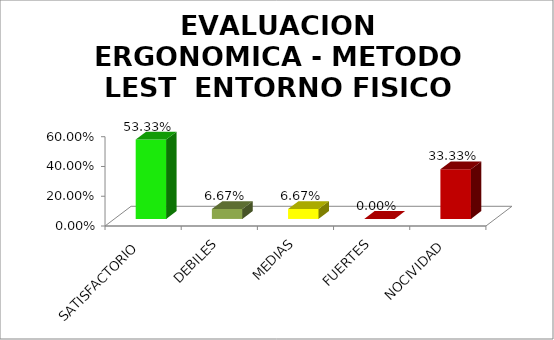
| Category | EVALUACION ERGONOMICA - METODO LEST  |
|---|---|
| SATISFACTORIO | 0.533 |
| DEBILES | 0.067 |
| MEDIAS | 0.067 |
| FUERTES | 0 |
| NOCIVIDAD | 0.333 |